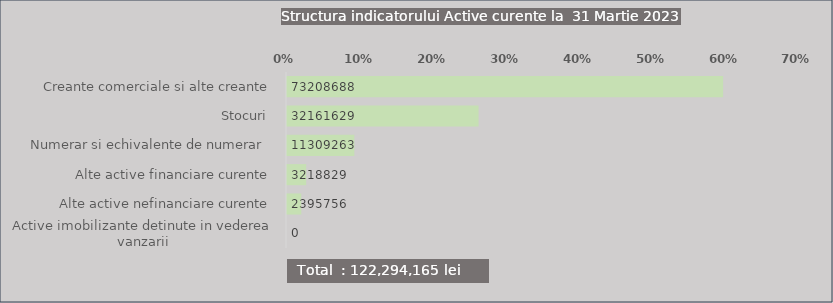
| Category | Series 0 |
|---|---|
| Creante comerciale si alte creante | 0.599 |
| Stocuri  | 0.263 |
| Numerar si echivalente de numerar  | 0.092 |
| Alte active financiare curente | 0.026 |
| Alte active nefinanciare curente | 0.02 |
| Active imobilizante detinute in vederea vanzarii | 0 |